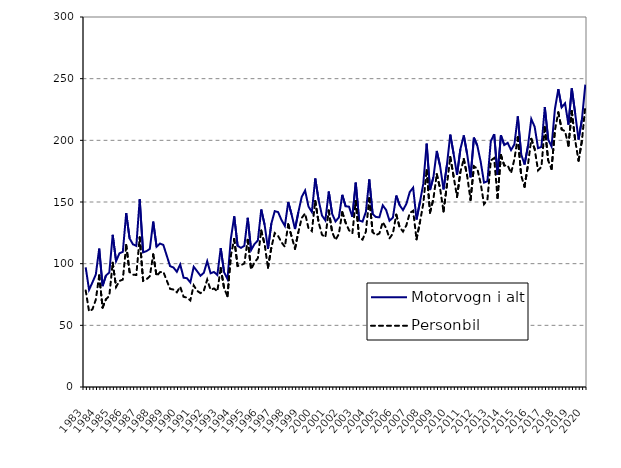
| Category | Motorvogn i alt | Personbil |
|---|---|---|
| 1983.0 | 97 | 78.3 |
| nan | 78.8 | 61.3 |
| nan | 84.8 | 63 |
| nan | 91.2 | 70.8 |
| 1984.0 | 112.2 | 90.4 |
| nan | 81.8 | 64.4 |
| nan | 90.4 | 71.1 |
| nan | 92.9 | 73.9 |
| 1985.0 | 123.4 | 100.8 |
| nan | 102 | 81.1 |
| nan | 108.4 | 86 |
| nan | 109.6 | 87.1 |
| 1986.0 | 141 | 115.2 |
| nan | 120.5 | 93.2 |
| nan | 115.7 | 91.1 |
| nan | 114.4 | 90.8 |
| 1987.0 | 152.2 | 121.3 |
| nan | 109.2 | 86.1 |
| nan | 110.1 | 87.3 |
| nan | 112 | 89.8 |
| 1988.0 | 134.1 | 107.5 |
| nan | 113.7 | 90 |
| nan | 116.3 | 93.1 |
| nan | 115.2 | 93.4 |
| 1989.0 | 106.6 | 86.4 |
| nan | 98 | 79.6 |
| nan | 96.9 | 79 |
| nan | 93.4 | 76.8 |
| 1990.0 | 99.4 | 81.3 |
| nan | 88.6 | 73.1 |
| nan | 88.2 | 72.5 |
| nan | 84.8 | 70.2 |
| 1991.0 | 97.5 | 82.4 |
| nan | 93.9 | 78 |
| nan | 90.2 | 76.1 |
| nan | 92.6 | 78.1 |
| 1992.0 | 102 | 87.1 |
| nan | 92.2 | 78.9 |
| nan | 93.3 | 79.9 |
| nan | 90.8 | 77.6 |
| 1993.0 | 112.6 | 96.5 |
| nan | 93 | 80.1 |
| nan | 87.5 | 73.6 |
| nan | 120.1 | 106.6 |
| 1994.0 | 138.4 | 120 |
| nan | 114.5 | 98.1 |
| nan | 112.8 | 98.8 |
| nan | 114.5 | 100.2 |
| 1995.0 | 137.2 | 119.3 |
| nan | 111 | 95.4 |
| nan | 115.9 | 101 |
| nan | 118.8 | 104.4 |
| 1996.0 | 143.9 | 126.9 |
| nan | 131.6 | 115.7 |
| nan | 112 | 96.7 |
| nan | 132.5 | 113.1 |
| 1997.0 | 142.6 | 124.8 |
| nan | 141.8 | 122.5 |
| nan | 135.4 | 117.3 |
| nan | 130.6 | 113.7 |
| 1998.0 | 150 | 131.9 |
| nan | 139.8 | 122 |
| nan | 128.1 | 112.1 |
| nan | 141.8 | 125.6 |
| 1999.0 | 154.2 | 137.1 |
| nan | 159.3 | 140.7 |
| nan | 146.3 | 128.7 |
| nan | 141.9 | 126.4 |
| 2000.0 | 169.1 | 150.9 |
| nan | 151.5 | 133.4 |
| nan | 139 | 123.5 |
| nan | 135.1 | 121.4 |
| 2001.0 | 158.5 | 143.1 |
| nan | 140.46 | 125.7 |
| nan | 134.24 | 119.2 |
| nan | 137.495 | 124.072 |
| 2002.0 | 155.814 | 141.724 |
| nan | 146.543 | 133.19 |
| nan | 146.231 | 127.141 |
| nan | 137.967 | 124.641 |
| 2003.0 | 165.679 | 150.811 |
| nan | 135.021 | 121.101 |
| nan | 134.111 | 119.491 |
| nan | 142.013 | 125.959 |
| 2004.0 | 168.309 | 153.043 |
| nan | 140.267 | 125.568 |
| nan | 137.77 | 123.121 |
| nan | 137.685 | 124.506 |
| 2005.0 | 147.311 | 133.756 |
| nan | 143.517 | 128.79 |
| nan | 134.783 | 120.571 |
| nan | 137.37 | 124.382 |
| 2006.0 | 155.213 | 139.728 |
| nan | 147.444 | 129.572 |
| nan | 143.451 | 126.006 |
| nan | 148.561 | 131.195 |
| 2007.0 | 158.1 | 141.084 |
| nan | 161.613 | 142.897 |
| nan | 135.821 | 119.753 |
| nan | 149.791 | 133.498 |
| 2008.0 | 164.642 | 148.614 |
| nan | 197.287 | 175.714 |
| nan | 159.718 | 141.407 |
| nan | 170.057 | 152.54 |
| 2009.0 | 191.38 | 172.559 |
| nan | 178.906 | 160.765 |
| nan | 160.234 | 142.312 |
| nan | 179.857 | 163.532 |
| 2010.0 | 204.636 | 186.507 |
| nan | 188.957 | 170.463 |
| nan | 172.077 | 154.156 |
| nan | 192.961 | 174.399 |
| 2011.0 | 204.005 | 184.86 |
| nan | 188.741 | 171.333 |
| nan | 169.934 | 151.694 |
| nan | 202.176 | 178.919 |
| 2012.0 | 195.829 | 177.072 |
| nan | 182.751 | 165.128 |
| nan | 165.73 | 148.242 |
| nan | 166.805 | 151.728 |
| 2013.0 | 199.181 | 183.653 |
| nan | 205.015 | 185.634 |
| nan | 172.044 | 153.21 |
| nan | 204.1 | 188.079 |
| 2014.0 | 196.177 | 179.552 |
| nan | 197.965 | 179.767 |
| nan | 192.105 | 173.474 |
| nan | 196.809 | 184.739 |
| 2015.0 | 219.419 | 202.592 |
| nan | 188.696 | 171.451 |
| nan | 180.388 | 162.297 |
| nan | 195.23 | 179.891 |
| 2016.0 | 217.298 | 201.197 |
| nan | 210.949 | 192.893 |
| nan | 193.648 | 175.642 |
| nan | 194.663 | 178.455 |
| 2017.0 | 227.029 | 210.738 |
| nan | 200.767 | 183.708 |
| nan | 195.059 | 176.766 |
| nan | 225.423 | 208.218 |
| 2018.0 | 241.528 | 222.678 |
| nan | 226.771 | 208.839 |
| nan | 230.044 | 207.395 |
| nan | 212.667 | 195.666 |
| 2019.0 | 242.056 | 223.584 |
| nan | 221.711 | 199.972 |
| nan | 200.668 | 183.518 |
| nan | 216.92 | 199.72 |
| 2020.0 | 245.163 | 227.947 |